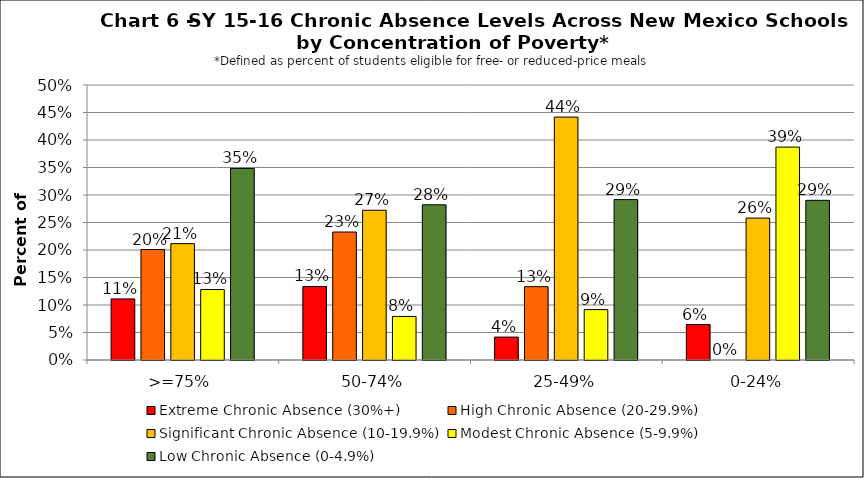
| Category | Extreme Chronic Absence (30%+) | High Chronic Absence (20-29.9%) | Significant Chronic Absence (10-19.9%) | Modest Chronic Absence (5-9.9%) | Low Chronic Absence (0-4.9%) |
|---|---|---|---|---|---|
| 0 | 0.111 | 0.201 | 0.212 | 0.128 | 0.348 |
| 1 | 0.134 | 0.233 | 0.272 | 0.079 | 0.282 |
| 2 | 0.042 | 0.133 | 0.442 | 0.092 | 0.292 |
| 3 | 0.065 | 0 | 0.258 | 0.387 | 0.29 |